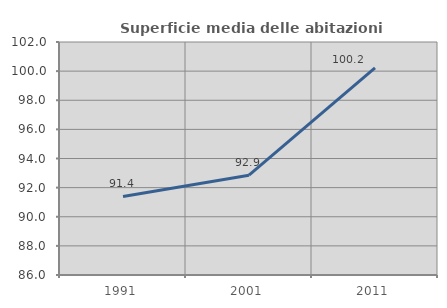
| Category | Superficie media delle abitazioni occupate |
|---|---|
| 1991.0 | 91.391 |
| 2001.0 | 92.855 |
| 2011.0 | 100.216 |